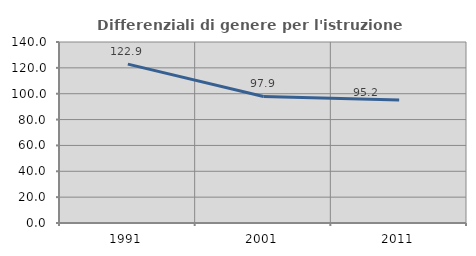
| Category | Differenziali di genere per l'istruzione superiore |
|---|---|
| 1991.0 | 122.907 |
| 2001.0 | 97.854 |
| 2011.0 | 95.201 |